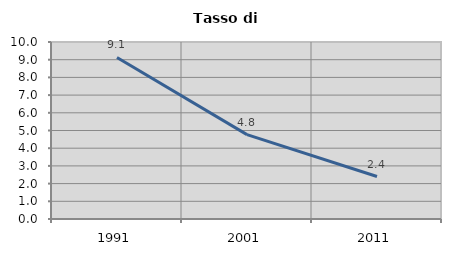
| Category | Tasso di disoccupazione   |
|---|---|
| 1991.0 | 9.125 |
| 2001.0 | 4.766 |
| 2011.0 | 2.401 |